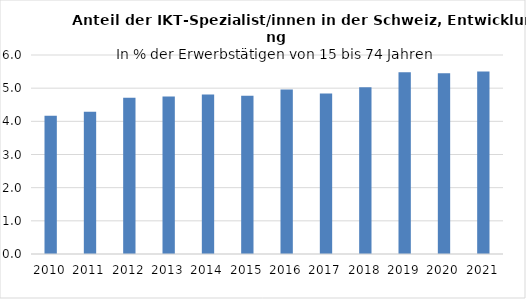
| Category | %  |
|---|---|
| 2010.0 | 4.17 |
| 2011.0 | 4.29 |
| 2012.0 | 4.71 |
| 2013.0 | 4.75 |
| 2014.0 | 4.81 |
| 2015.0 | 4.77 |
| 2016.0 | 4.96 |
| 2017.0 | 4.84 |
| 2018.0 | 5.03 |
| 2019.0 | 5.48 |
| 2020.0 | 5.45 |
| 2021.0 | 5.5 |